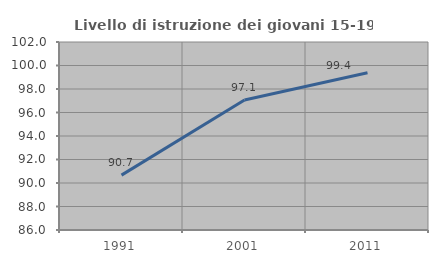
| Category | Livello di istruzione dei giovani 15-19 anni |
|---|---|
| 1991.0 | 90.67 |
| 2001.0 | 97.059 |
| 2011.0 | 99.378 |